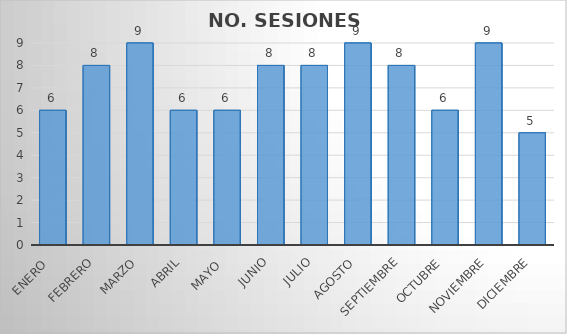
| Category | NO. SESIONES EFECTUADAS |
|---|---|
| Enero  | 6 |
| Febrero | 8 |
| Marzo | 9 |
| Abril | 6 |
| Mayo  | 6 |
| Junio | 8 |
| Julio | 8 |
| Agosto | 9 |
| Septiembre | 8 |
| Octubre | 6 |
| Noviembre | 9 |
| Diciembre | 5 |